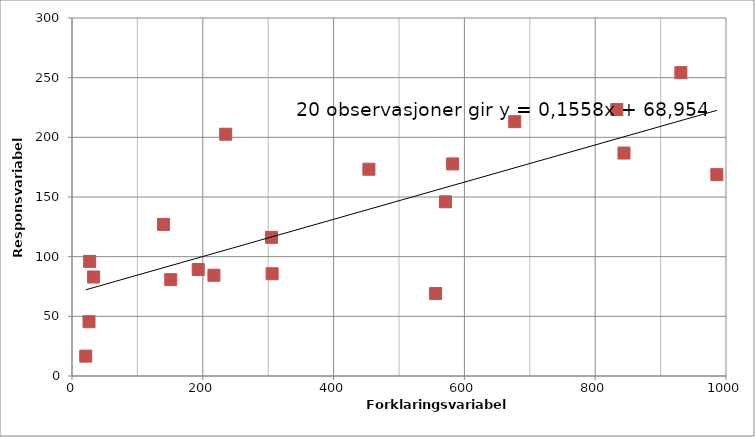
| Category | Series 1 |
|---|---|
| 454.0 | 173.261 |
| 193.0 | 89.232 |
| 33.0 | 82.96 |
| 677.0 | 213.135 |
| 140.0 | 127.05 |
| 556.0 | 69.122 |
| 833.0 | 223.287 |
| 305.0 | 116.182 |
| 27.0 | 96.057 |
| 582.0 | 177.722 |
| 986.0 | 168.719 |
| 217.0 | 84.426 |
| 571.0 | 145.98 |
| 306.0 | 85.683 |
| 844.0 | 186.844 |
| 235.0 | 202.604 |
| 151.0 | 80.744 |
| 26.0 | 45.486 |
| 931.0 | 254.224 |
| 21.0 | 16.649 |